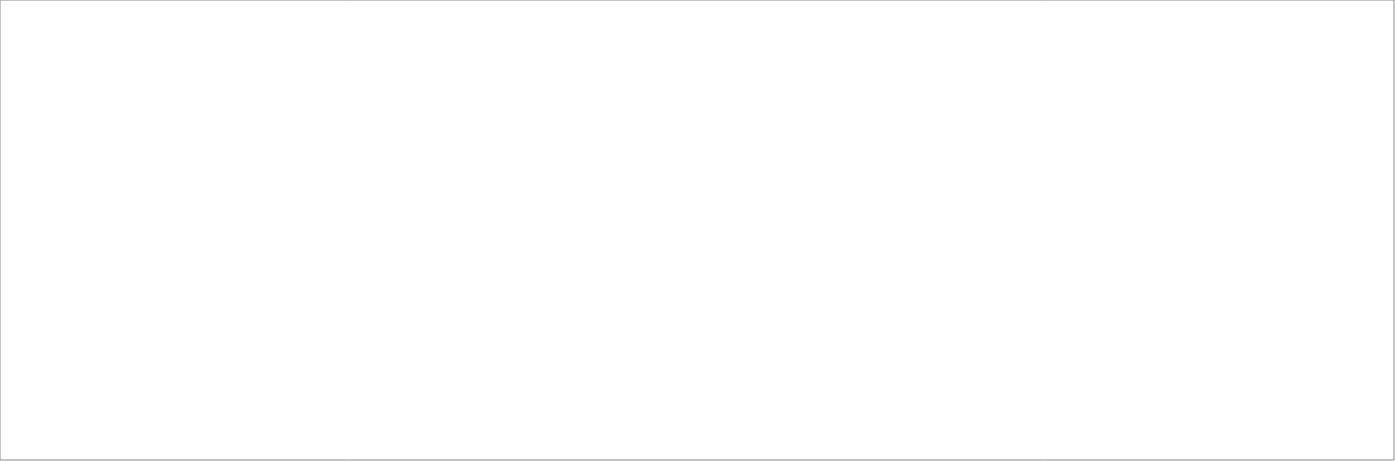
| Category | Actividades empresariales y otras actividades inmobiliarias |
|---|---|
| 2018_I | 8352.523 |
| 2018_II | 8775.618 |
| 2018_III | 8951.018 |
| 2018_IV | 8645.208 |
| 2019_I | 8919.009 |
| 2019_II | 9255.838 |
| 2019_III | 0 |
| 2019_IV | 0 |